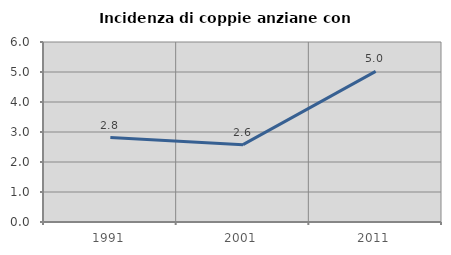
| Category | Incidenza di coppie anziane con figli |
|---|---|
| 1991.0 | 2.814 |
| 2001.0 | 2.578 |
| 2011.0 | 5.019 |